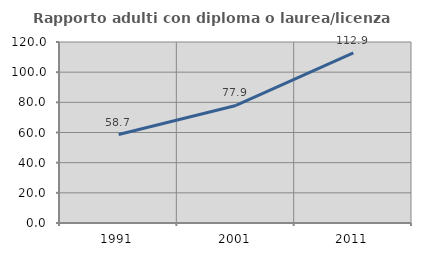
| Category | Rapporto adulti con diploma o laurea/licenza media  |
|---|---|
| 1991.0 | 58.67 |
| 2001.0 | 77.949 |
| 2011.0 | 112.858 |